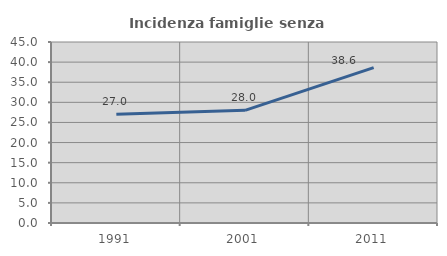
| Category | Incidenza famiglie senza nuclei |
|---|---|
| 1991.0 | 27.007 |
| 2001.0 | 28.009 |
| 2011.0 | 38.636 |